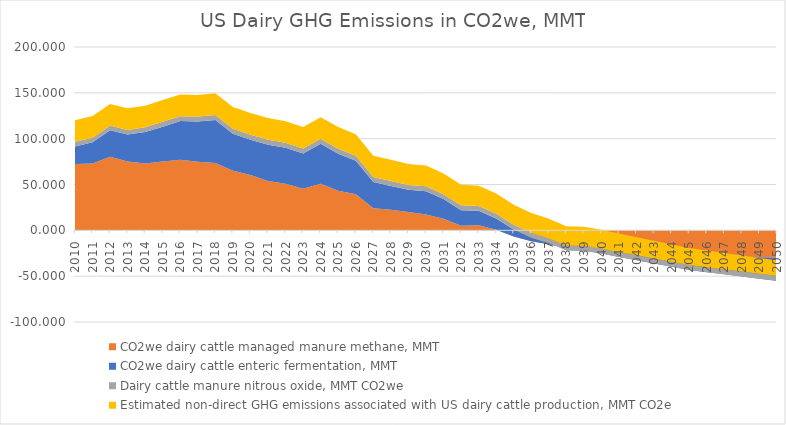
| Category | CO2we dairy cattle managed manure methane, MMT | CO2we dairy cattle enteric fermentation, MMT | Dairy cattle manure nitrous oxide, MMT CO2we | Estimated non-direct GHG emissions associated with US dairy cattle production, MMT CO2e |
|---|---|---|---|---|
| 2010.0 | 72.477 | 19.063 | 5.035 | 23.622 |
| 2011.0 | 72.872 | 23.131 | 5.114 | 23.622 |
| 2012.0 | 80.357 | 28.801 | 5.168 | 23.622 |
| 2013.0 | 74.956 | 29.468 | 5.141 | 23.622 |
| 2014.0 | 72.995 | 34.226 | 5.194 | 23.622 |
| 2015.0 | 74.998 | 38.127 | 5.326 | 23.622 |
| 2016.0 | 76.987 | 42.179 | 5.38 | 23.622 |
| 2017.0 | 74.812 | 43.908 | 5.406 | 23.622 |
| 2018.0 | 73.318 | 47.112 | 5.459 | 23.622 |
| 2019.0 | 65.021 | 40.449 | 5.38 | 23.622 |
| 2020.0 | 60.331 | 38.545 | 5.406 | 23.622 |
| 2021.0 | 53.739 | 39.735 | 5.406 | 23.622 |
| 2022.0 | 50.72 | 39.378 | 5.406 | 23.622 |
| 2023.0 | 45.323 | 38.426 | 5.406 | 23.622 |
| 2024.0 | 50.758 | 43.662 | 5.406 | 23.622 |
| 2025.0 | 43.224 | 40.449 | 5.406 | 23.622 |
| 2026.0 | 39.272 | 36.703 | 5.406 | 23.445 |
| 2027.0 | 24.03 | 28.672 | 5.406 | 23.269 |
| 2028.0 | 22.37 | 25.996 | 5.406 | 23.094 |
| 2029.0 | 20.13 | 24.035 | 5.406 | 22.921 |
| 2030.0 | 17.191 | 25.405 | 5.406 | 22.749 |
| 2031.0 | 12.568 | 21.517 | 5.406 | 22.522 |
| 2032.0 | 5.122 | 16.813 | 5.406 | 22.296 |
| 2033.0 | 5.445 | 15.815 | 5.406 | 22.073 |
| 2034.0 | 0.564 | 12.336 | 5.406 | 21.853 |
| 2035.0 | -6.665 | 7.446 | 5.406 | 21.634 |
| 2036.0 | -11.839 | 3.881 | 5.406 | 21.418 |
| 2037.0 | -15.197 | 1.285 | 5.406 | 21.204 |
| 2038.0 | -19.833 | -2.009 | 5.406 | 20.992 |
| 2039.0 | -20.511 | -1.835 | 5.406 | 20.782 |
| 2040.0 | -21.865 | -3.43 | 5.406 | 20.574 |
| 2041.0 | -23.191 | -5.799 | 5.406 | 20.162 |
| 2042.0 | -24.491 | -8.133 | 5.406 | 19.759 |
| 2043.0 | -25.765 | -10.431 | 5.406 | 19.364 |
| 2044.0 | -27.014 | -12.695 | 5.406 | 18.977 |
| 2045.0 | -28.236 | -14.925 | 5.406 | 18.597 |
| 2046.0 | -28.549 | -17.067 | 5.406 | 18.225 |
| 2047.0 | -28.85 | -19.176 | 5.406 | 17.861 |
| 2048.0 | -29.139 | -21.253 | 5.406 | 17.503 |
| 2049.0 | -29.416 | -23.298 | 5.406 | 17.153 |
| 2050.0 | -29.683 | -25.312 | 5.406 | 16.81 |